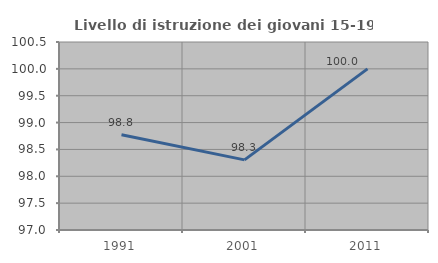
| Category | Livello di istruzione dei giovani 15-19 anni |
|---|---|
| 1991.0 | 98.773 |
| 2001.0 | 98.305 |
| 2011.0 | 100 |